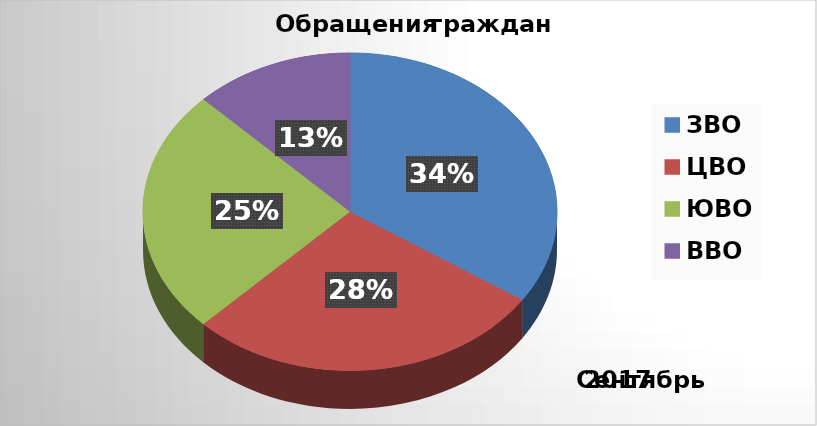
| Category | Series 0 |
|---|---|
| ЗВО | 11 |
| ЦВО | 9 |
| ЮВО | 8 |
| ВВО | 4 |